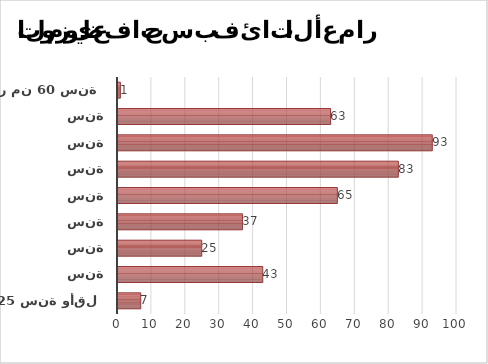
| Category | Series 1 |
|---|---|
| 25 سنة وأقل | 7 |
| ما بين 26 و30 سنة | 43 |
| ما بين 31 و35 سنة | 25 |
| ما بين 36 و40 سنة | 37 |
| ما بين 41 و45 سنة | 65 |
| ما بين 46 و50 سنة | 83 |
| ما بين 51 و55 سنة | 93 |
| ما بين 56 و60 سنة | 63 |
| أكثر من 60 سنة | 1 |